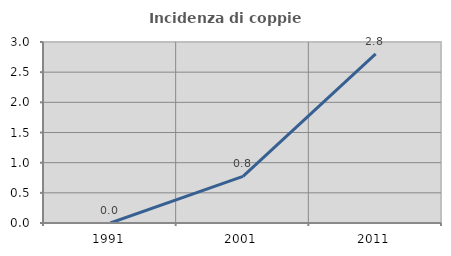
| Category | Incidenza di coppie miste |
|---|---|
| 1991.0 | 0 |
| 2001.0 | 0.773 |
| 2011.0 | 2.804 |